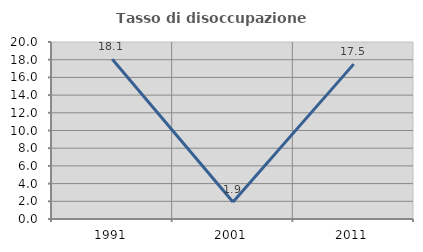
| Category | Tasso di disoccupazione giovanile  |
|---|---|
| 1991.0 | 18.056 |
| 2001.0 | 1.923 |
| 2011.0 | 17.5 |